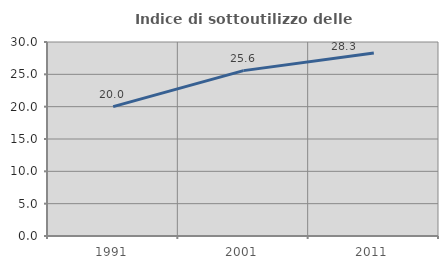
| Category | Indice di sottoutilizzo delle abitazioni  |
|---|---|
| 1991.0 | 20.006 |
| 2001.0 | 25.573 |
| 2011.0 | 28.287 |